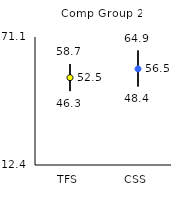
| Category | 25th | 75th | Mean |
|---|---|---|---|
| TFS | 46.3 | 58.7 | 52.45 |
| CSS | 48.4 | 64.9 | 56.49 |